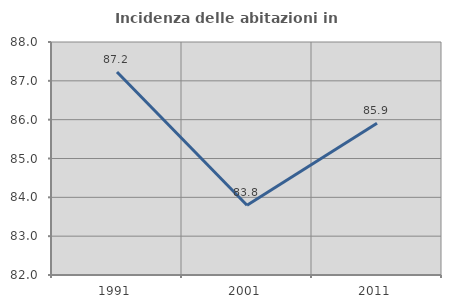
| Category | Incidenza delle abitazioni in proprietà  |
|---|---|
| 1991.0 | 87.226 |
| 2001.0 | 83.795 |
| 2011.0 | 85.91 |